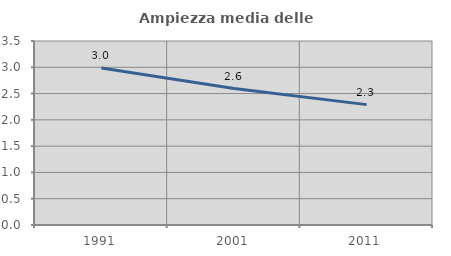
| Category | Ampiezza media delle famiglie |
|---|---|
| 1991.0 | 2.987 |
| 2001.0 | 2.595 |
| 2011.0 | 2.29 |